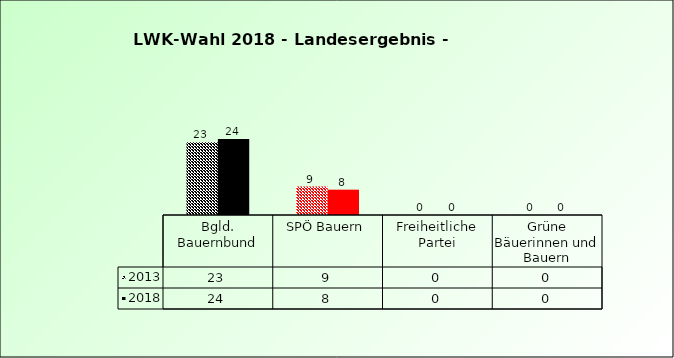
| Category | 2013 | 2018 |
|---|---|---|
| Bgld. Bauernbund | 23 | 24 |
| SPÖ Bauern | 9 | 8 |
| Freiheitliche Partei | 0 | 0 |
| Grüne Bäuerinnen und Bauern | 0 | 0 |